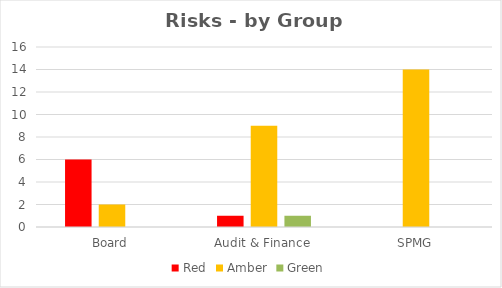
| Category | Red | Amber | Green |
|---|---|---|---|
| Board | 6 | 2 | 0 |
| Audit & Finance | 1 | 9 | 1 |
| SPMG | 0 | 14 | 0 |